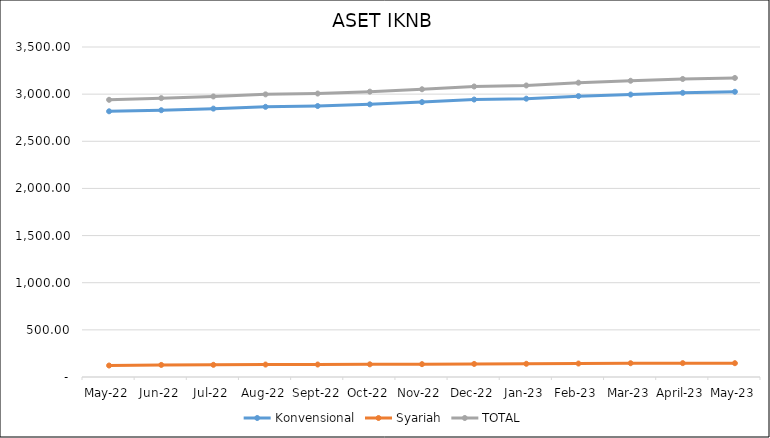
| Category |  Konvensional  |  Syariah  | TOTAL |
|---|---|---|---|
| May-22 | 2818.132 | 121.758 | 2939.89 |
| Jun-22 | 2829.665 | 128.036 | 2957.702 |
| Jul-22 | 2846.372 | 129.148 | 2975.52 |
| Aug-22 | 2865.619 | 132.075 | 2997.694 |
| Sep-22 | 2873.938 | 132.351 | 3006.289 |
| Oct-22 | 2891.826 | 134.628 | 3026.454 |
| Nov-22 | 2915.393 | 136.376 | 3051.769 |
| Dec-22 | 2942.716 | 138.533 | 3081.249 |
| Jan-23 | 2951.832 | 140.165 | 3091.997 |
| Feb-23 | 2978.913 | 142.696 | 3121.609 |
| Mar-23 | 2995.706 | 146.066 | 3141.772 |
| April-23 | 3013.962 | 147.013 | 3160.975 |
| May-23 | 3025.142 | 146.46 | 3171.602 |